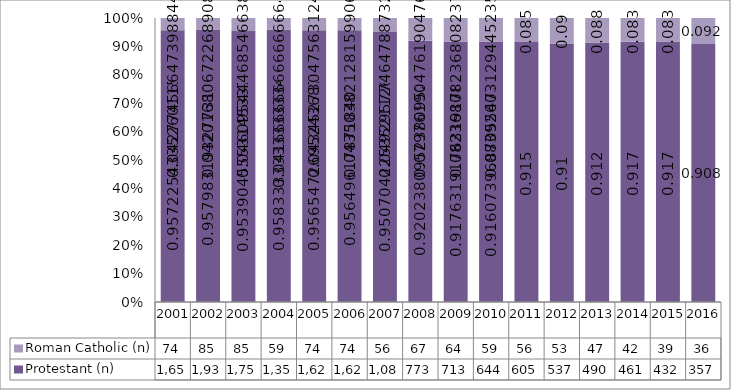
| Category | Protestant (n) | Roman Catholic (n) |
|---|---|---|
| 2001.0 | 1656 | 74 |
| 2002.0 | 1938 | 85 |
| 2003.0 | 1759 | 85 |
| 2004.0 | 1357 | 59 |
| 2005.0 | 1629 | 74 |
| 2006.0 | 1627 | 74 |
| 2007.0 | 1080 | 56 |
| 2008.0 | 773 | 67 |
| 2009.0 | 713 | 64 |
| 2010.0 | 644 | 59 |
| 2011.0 | 605 | 56 |
| 2012.0 | 537 | 53 |
| 2013.0 | 490 | 47 |
| 2014.0 | 461 | 42 |
| 2015.0 | 432 | 39 |
| 2016.0 | 357 | 36 |